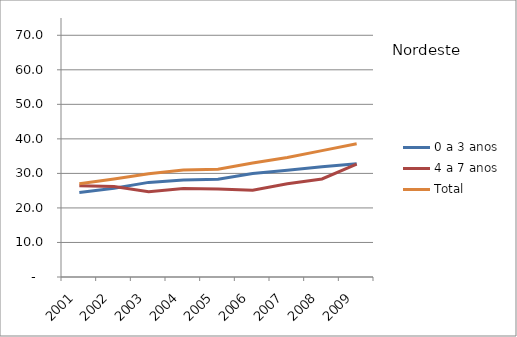
| Category | 0 a 3 anos | 4 a 7 anos | Total |
|---|---|---|---|
| 2001 | 24.5 | 26.4 | 27 |
| 2002 | 25.7 | 26.2 | 28.4 |
| 2003 | 27.4 | 24.7 | 29.9 |
| 2004 | 28.1 | 25.6 | 31 |
| 2005 | 28.3 | 25.5 | 31.2 |
| 2006 | 30 | 25.1 | 33 |
| 2007 | 30.9 | 27 | 34.6 |
| 2008 | 31.9 | 28.4 | 36.6 |
| 2009 | 32.8 | 32.7 | 38.6 |